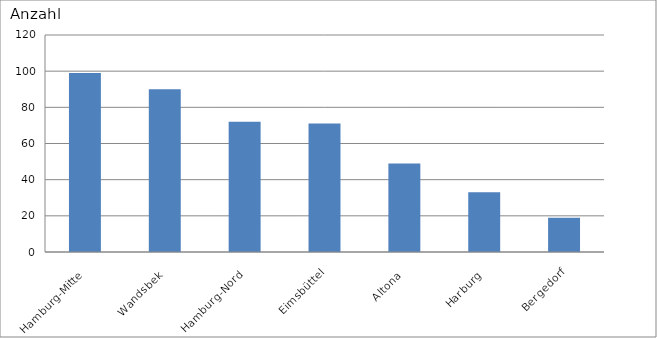
| Category | Hamburg-Mitte Wandsbek Hamburg-Nord Eimsbüttel Altona Harburg Bergedorf |
|---|---|
| Hamburg-Mitte | 99 |
| Wandsbek | 90 |
| Hamburg-Nord | 72 |
| Eimsbüttel | 71 |
| Altona | 49 |
| Harburg | 33 |
| Bergedorf | 19 |